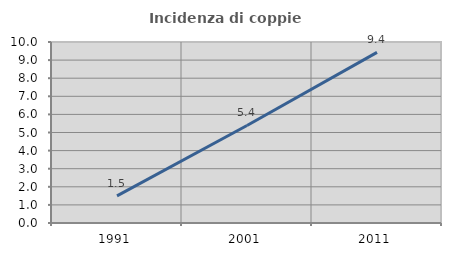
| Category | Incidenza di coppie miste |
|---|---|
| 1991.0 | 1.502 |
| 2001.0 | 5.389 |
| 2011.0 | 9.426 |